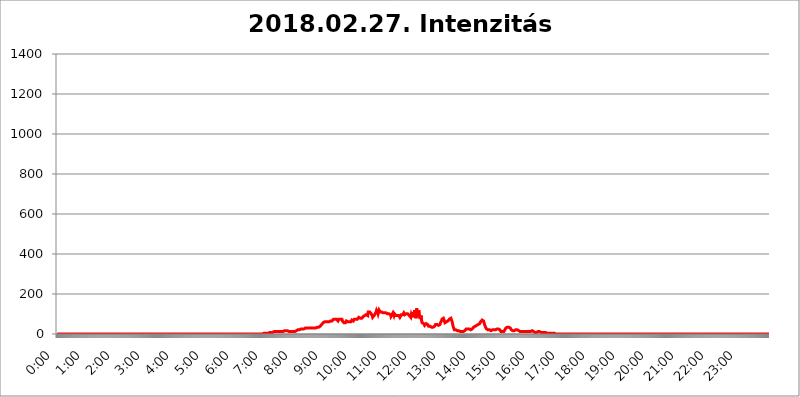
| Category | 2018.02.27. Intenzitás [W/m^2] |
|---|---|
| 0.0 | 0 |
| 0.0006944444444444445 | 0 |
| 0.001388888888888889 | 0 |
| 0.0020833333333333333 | 0 |
| 0.002777777777777778 | 0 |
| 0.003472222222222222 | 0 |
| 0.004166666666666667 | 0 |
| 0.004861111111111111 | 0 |
| 0.005555555555555556 | 0 |
| 0.0062499999999999995 | 0 |
| 0.006944444444444444 | 0 |
| 0.007638888888888889 | 0 |
| 0.008333333333333333 | 0 |
| 0.009027777777777779 | 0 |
| 0.009722222222222222 | 0 |
| 0.010416666666666666 | 0 |
| 0.011111111111111112 | 0 |
| 0.011805555555555555 | 0 |
| 0.012499999999999999 | 0 |
| 0.013194444444444444 | 0 |
| 0.013888888888888888 | 0 |
| 0.014583333333333332 | 0 |
| 0.015277777777777777 | 0 |
| 0.015972222222222224 | 0 |
| 0.016666666666666666 | 0 |
| 0.017361111111111112 | 0 |
| 0.018055555555555557 | 0 |
| 0.01875 | 0 |
| 0.019444444444444445 | 0 |
| 0.02013888888888889 | 0 |
| 0.020833333333333332 | 0 |
| 0.02152777777777778 | 0 |
| 0.022222222222222223 | 0 |
| 0.02291666666666667 | 0 |
| 0.02361111111111111 | 0 |
| 0.024305555555555556 | 0 |
| 0.024999999999999998 | 0 |
| 0.025694444444444447 | 0 |
| 0.02638888888888889 | 0 |
| 0.027083333333333334 | 0 |
| 0.027777777777777776 | 0 |
| 0.02847222222222222 | 0 |
| 0.029166666666666664 | 0 |
| 0.029861111111111113 | 0 |
| 0.030555555555555555 | 0 |
| 0.03125 | 0 |
| 0.03194444444444445 | 0 |
| 0.03263888888888889 | 0 |
| 0.03333333333333333 | 0 |
| 0.034027777777777775 | 0 |
| 0.034722222222222224 | 0 |
| 0.035416666666666666 | 0 |
| 0.036111111111111115 | 0 |
| 0.03680555555555556 | 0 |
| 0.0375 | 0 |
| 0.03819444444444444 | 0 |
| 0.03888888888888889 | 0 |
| 0.03958333333333333 | 0 |
| 0.04027777777777778 | 0 |
| 0.04097222222222222 | 0 |
| 0.041666666666666664 | 0 |
| 0.042361111111111106 | 0 |
| 0.04305555555555556 | 0 |
| 0.043750000000000004 | 0 |
| 0.044444444444444446 | 0 |
| 0.04513888888888889 | 0 |
| 0.04583333333333334 | 0 |
| 0.04652777777777778 | 0 |
| 0.04722222222222222 | 0 |
| 0.04791666666666666 | 0 |
| 0.04861111111111111 | 0 |
| 0.049305555555555554 | 0 |
| 0.049999999999999996 | 0 |
| 0.05069444444444445 | 0 |
| 0.051388888888888894 | 0 |
| 0.052083333333333336 | 0 |
| 0.05277777777777778 | 0 |
| 0.05347222222222222 | 0 |
| 0.05416666666666667 | 0 |
| 0.05486111111111111 | 0 |
| 0.05555555555555555 | 0 |
| 0.05625 | 0 |
| 0.05694444444444444 | 0 |
| 0.057638888888888885 | 0 |
| 0.05833333333333333 | 0 |
| 0.05902777777777778 | 0 |
| 0.059722222222222225 | 0 |
| 0.06041666666666667 | 0 |
| 0.061111111111111116 | 0 |
| 0.06180555555555556 | 0 |
| 0.0625 | 0 |
| 0.06319444444444444 | 0 |
| 0.06388888888888888 | 0 |
| 0.06458333333333334 | 0 |
| 0.06527777777777778 | 0 |
| 0.06597222222222222 | 0 |
| 0.06666666666666667 | 0 |
| 0.06736111111111111 | 0 |
| 0.06805555555555555 | 0 |
| 0.06874999999999999 | 0 |
| 0.06944444444444443 | 0 |
| 0.07013888888888889 | 0 |
| 0.07083333333333333 | 0 |
| 0.07152777777777779 | 0 |
| 0.07222222222222223 | 0 |
| 0.07291666666666667 | 0 |
| 0.07361111111111111 | 0 |
| 0.07430555555555556 | 0 |
| 0.075 | 0 |
| 0.07569444444444444 | 0 |
| 0.0763888888888889 | 0 |
| 0.07708333333333334 | 0 |
| 0.07777777777777778 | 0 |
| 0.07847222222222222 | 0 |
| 0.07916666666666666 | 0 |
| 0.0798611111111111 | 0 |
| 0.08055555555555556 | 0 |
| 0.08125 | 0 |
| 0.08194444444444444 | 0 |
| 0.08263888888888889 | 0 |
| 0.08333333333333333 | 0 |
| 0.08402777777777777 | 0 |
| 0.08472222222222221 | 0 |
| 0.08541666666666665 | 0 |
| 0.08611111111111112 | 0 |
| 0.08680555555555557 | 0 |
| 0.08750000000000001 | 0 |
| 0.08819444444444445 | 0 |
| 0.08888888888888889 | 0 |
| 0.08958333333333333 | 0 |
| 0.09027777777777778 | 0 |
| 0.09097222222222222 | 0 |
| 0.09166666666666667 | 0 |
| 0.09236111111111112 | 0 |
| 0.09305555555555556 | 0 |
| 0.09375 | 0 |
| 0.09444444444444444 | 0 |
| 0.09513888888888888 | 0 |
| 0.09583333333333333 | 0 |
| 0.09652777777777777 | 0 |
| 0.09722222222222222 | 0 |
| 0.09791666666666667 | 0 |
| 0.09861111111111111 | 0 |
| 0.09930555555555555 | 0 |
| 0.09999999999999999 | 0 |
| 0.10069444444444443 | 0 |
| 0.1013888888888889 | 0 |
| 0.10208333333333335 | 0 |
| 0.10277777777777779 | 0 |
| 0.10347222222222223 | 0 |
| 0.10416666666666667 | 0 |
| 0.10486111111111111 | 0 |
| 0.10555555555555556 | 0 |
| 0.10625 | 0 |
| 0.10694444444444444 | 0 |
| 0.1076388888888889 | 0 |
| 0.10833333333333334 | 0 |
| 0.10902777777777778 | 0 |
| 0.10972222222222222 | 0 |
| 0.1111111111111111 | 0 |
| 0.11180555555555556 | 0 |
| 0.11180555555555556 | 0 |
| 0.1125 | 0 |
| 0.11319444444444444 | 0 |
| 0.11388888888888889 | 0 |
| 0.11458333333333333 | 0 |
| 0.11527777777777777 | 0 |
| 0.11597222222222221 | 0 |
| 0.11666666666666665 | 0 |
| 0.1173611111111111 | 0 |
| 0.11805555555555557 | 0 |
| 0.11944444444444445 | 0 |
| 0.12013888888888889 | 0 |
| 0.12083333333333333 | 0 |
| 0.12152777777777778 | 0 |
| 0.12222222222222223 | 0 |
| 0.12291666666666667 | 0 |
| 0.12291666666666667 | 0 |
| 0.12361111111111112 | 0 |
| 0.12430555555555556 | 0 |
| 0.125 | 0 |
| 0.12569444444444444 | 0 |
| 0.12638888888888888 | 0 |
| 0.12708333333333333 | 0 |
| 0.16875 | 0 |
| 0.12847222222222224 | 0 |
| 0.12916666666666668 | 0 |
| 0.12986111111111112 | 0 |
| 0.13055555555555556 | 0 |
| 0.13125 | 0 |
| 0.13194444444444445 | 0 |
| 0.1326388888888889 | 0 |
| 0.13333333333333333 | 0 |
| 0.13402777777777777 | 0 |
| 0.13402777777777777 | 0 |
| 0.13472222222222222 | 0 |
| 0.13541666666666666 | 0 |
| 0.1361111111111111 | 0 |
| 0.13749999999999998 | 0 |
| 0.13819444444444443 | 0 |
| 0.1388888888888889 | 0 |
| 0.13958333333333334 | 0 |
| 0.14027777777777778 | 0 |
| 0.14097222222222222 | 0 |
| 0.14166666666666666 | 0 |
| 0.1423611111111111 | 0 |
| 0.14305555555555557 | 0 |
| 0.14375000000000002 | 0 |
| 0.14444444444444446 | 0 |
| 0.1451388888888889 | 0 |
| 0.1451388888888889 | 0 |
| 0.14652777777777778 | 0 |
| 0.14722222222222223 | 0 |
| 0.14791666666666667 | 0 |
| 0.1486111111111111 | 0 |
| 0.14930555555555555 | 0 |
| 0.15 | 0 |
| 0.15069444444444444 | 0 |
| 0.15138888888888888 | 0 |
| 0.15208333333333332 | 0 |
| 0.15277777777777776 | 0 |
| 0.15347222222222223 | 0 |
| 0.15416666666666667 | 0 |
| 0.15486111111111112 | 0 |
| 0.15555555555555556 | 0 |
| 0.15625 | 0 |
| 0.15694444444444444 | 0 |
| 0.15763888888888888 | 0 |
| 0.15833333333333333 | 0 |
| 0.15902777777777777 | 0 |
| 0.15972222222222224 | 0 |
| 0.16041666666666668 | 0 |
| 0.16111111111111112 | 0 |
| 0.16180555555555556 | 0 |
| 0.1625 | 0 |
| 0.16319444444444445 | 0 |
| 0.1638888888888889 | 0 |
| 0.16458333333333333 | 0 |
| 0.16527777777777777 | 0 |
| 0.16597222222222222 | 0 |
| 0.16666666666666666 | 0 |
| 0.1673611111111111 | 0 |
| 0.16805555555555554 | 0 |
| 0.16874999999999998 | 0 |
| 0.16944444444444443 | 0 |
| 0.17013888888888887 | 0 |
| 0.1708333333333333 | 0 |
| 0.17152777777777775 | 0 |
| 0.17222222222222225 | 0 |
| 0.1729166666666667 | 0 |
| 0.17361111111111113 | 0 |
| 0.17430555555555557 | 0 |
| 0.17500000000000002 | 0 |
| 0.17569444444444446 | 0 |
| 0.1763888888888889 | 0 |
| 0.17708333333333334 | 0 |
| 0.17777777777777778 | 0 |
| 0.17847222222222223 | 0 |
| 0.17916666666666667 | 0 |
| 0.1798611111111111 | 0 |
| 0.18055555555555555 | 0 |
| 0.18125 | 0 |
| 0.18194444444444444 | 0 |
| 0.1826388888888889 | 0 |
| 0.18333333333333335 | 0 |
| 0.1840277777777778 | 0 |
| 0.18472222222222223 | 0 |
| 0.18541666666666667 | 0 |
| 0.18611111111111112 | 0 |
| 0.18680555555555556 | 0 |
| 0.1875 | 0 |
| 0.18819444444444444 | 0 |
| 0.18888888888888888 | 0 |
| 0.18958333333333333 | 0 |
| 0.19027777777777777 | 0 |
| 0.1909722222222222 | 0 |
| 0.19166666666666665 | 0 |
| 0.19236111111111112 | 0 |
| 0.19305555555555554 | 0 |
| 0.19375 | 0 |
| 0.19444444444444445 | 0 |
| 0.1951388888888889 | 0 |
| 0.19583333333333333 | 0 |
| 0.19652777777777777 | 0 |
| 0.19722222222222222 | 0 |
| 0.19791666666666666 | 0 |
| 0.1986111111111111 | 0 |
| 0.19930555555555554 | 0 |
| 0.19999999999999998 | 0 |
| 0.20069444444444443 | 0 |
| 0.20138888888888887 | 0 |
| 0.2020833333333333 | 0 |
| 0.2027777777777778 | 0 |
| 0.2034722222222222 | 0 |
| 0.2041666666666667 | 0 |
| 0.20486111111111113 | 0 |
| 0.20555555555555557 | 0 |
| 0.20625000000000002 | 0 |
| 0.20694444444444446 | 0 |
| 0.2076388888888889 | 0 |
| 0.20833333333333334 | 0 |
| 0.20902777777777778 | 0 |
| 0.20972222222222223 | 0 |
| 0.21041666666666667 | 0 |
| 0.2111111111111111 | 0 |
| 0.21180555555555555 | 0 |
| 0.2125 | 0 |
| 0.21319444444444444 | 0 |
| 0.2138888888888889 | 0 |
| 0.21458333333333335 | 0 |
| 0.2152777777777778 | 0 |
| 0.21597222222222223 | 0 |
| 0.21666666666666667 | 0 |
| 0.21736111111111112 | 0 |
| 0.21805555555555556 | 0 |
| 0.21875 | 0 |
| 0.21944444444444444 | 0 |
| 0.22013888888888888 | 0 |
| 0.22083333333333333 | 0 |
| 0.22152777777777777 | 0 |
| 0.2222222222222222 | 0 |
| 0.22291666666666665 | 0 |
| 0.2236111111111111 | 0 |
| 0.22430555555555556 | 0 |
| 0.225 | 0 |
| 0.22569444444444445 | 0 |
| 0.2263888888888889 | 0 |
| 0.22708333333333333 | 0 |
| 0.22777777777777777 | 0 |
| 0.22847222222222222 | 0 |
| 0.22916666666666666 | 0 |
| 0.2298611111111111 | 0 |
| 0.23055555555555554 | 0 |
| 0.23124999999999998 | 0 |
| 0.23194444444444443 | 0 |
| 0.23263888888888887 | 0 |
| 0.2333333333333333 | 0 |
| 0.2340277777777778 | 0 |
| 0.2347222222222222 | 0 |
| 0.2354166666666667 | 0 |
| 0.23611111111111113 | 0 |
| 0.23680555555555557 | 0 |
| 0.23750000000000002 | 0 |
| 0.23819444444444446 | 0 |
| 0.2388888888888889 | 0 |
| 0.23958333333333334 | 0 |
| 0.24027777777777778 | 0 |
| 0.24097222222222223 | 0 |
| 0.24166666666666667 | 0 |
| 0.2423611111111111 | 0 |
| 0.24305555555555555 | 0 |
| 0.24375 | 0 |
| 0.24444444444444446 | 0 |
| 0.24513888888888888 | 0 |
| 0.24583333333333335 | 0 |
| 0.2465277777777778 | 0 |
| 0.24722222222222223 | 0 |
| 0.24791666666666667 | 0 |
| 0.24861111111111112 | 0 |
| 0.24930555555555556 | 0 |
| 0.25 | 0 |
| 0.25069444444444444 | 0 |
| 0.2513888888888889 | 0 |
| 0.2520833333333333 | 0 |
| 0.25277777777777777 | 0 |
| 0.2534722222222222 | 0 |
| 0.25416666666666665 | 0 |
| 0.2548611111111111 | 0 |
| 0.2555555555555556 | 0 |
| 0.25625000000000003 | 0 |
| 0.2569444444444445 | 0 |
| 0.2576388888888889 | 0 |
| 0.25833333333333336 | 0 |
| 0.2590277777777778 | 0 |
| 0.25972222222222224 | 0 |
| 0.2604166666666667 | 0 |
| 0.2611111111111111 | 0 |
| 0.26180555555555557 | 0 |
| 0.2625 | 0 |
| 0.26319444444444445 | 0 |
| 0.2638888888888889 | 0 |
| 0.26458333333333334 | 0 |
| 0.2652777777777778 | 0 |
| 0.2659722222222222 | 0 |
| 0.26666666666666666 | 0 |
| 0.2673611111111111 | 0 |
| 0.26805555555555555 | 0 |
| 0.26875 | 0 |
| 0.26944444444444443 | 0 |
| 0.2701388888888889 | 0 |
| 0.2708333333333333 | 0 |
| 0.27152777777777776 | 0 |
| 0.2722222222222222 | 0 |
| 0.27291666666666664 | 0 |
| 0.2736111111111111 | 0 |
| 0.2743055555555555 | 0 |
| 0.27499999999999997 | 0 |
| 0.27569444444444446 | 0 |
| 0.27638888888888885 | 0 |
| 0.27708333333333335 | 0 |
| 0.2777777777777778 | 0 |
| 0.27847222222222223 | 0 |
| 0.2791666666666667 | 0 |
| 0.2798611111111111 | 0 |
| 0.28055555555555556 | 0 |
| 0.28125 | 0 |
| 0.28194444444444444 | 0 |
| 0.2826388888888889 | 0 |
| 0.2833333333333333 | 0 |
| 0.28402777777777777 | 0 |
| 0.2847222222222222 | 0 |
| 0.28541666666666665 | 0 |
| 0.28611111111111115 | 0 |
| 0.28680555555555554 | 0 |
| 0.28750000000000003 | 0 |
| 0.2881944444444445 | 3.525 |
| 0.2888888888888889 | 3.525 |
| 0.28958333333333336 | 3.525 |
| 0.2902777777777778 | 3.525 |
| 0.29097222222222224 | 3.525 |
| 0.2916666666666667 | 3.525 |
| 0.2923611111111111 | 3.525 |
| 0.29305555555555557 | 3.525 |
| 0.29375 | 3.525 |
| 0.29444444444444445 | 3.525 |
| 0.2951388888888889 | 3.525 |
| 0.29583333333333334 | 3.525 |
| 0.2965277777777778 | 3.525 |
| 0.2972222222222222 | 3.525 |
| 0.29791666666666666 | 7.887 |
| 0.2986111111111111 | 7.887 |
| 0.29930555555555555 | 7.887 |
| 0.3 | 7.887 |
| 0.30069444444444443 | 7.887 |
| 0.3013888888888889 | 7.887 |
| 0.3020833333333333 | 7.887 |
| 0.30277777777777776 | 7.887 |
| 0.3034722222222222 | 7.887 |
| 0.30416666666666664 | 12.257 |
| 0.3048611111111111 | 7.887 |
| 0.3055555555555555 | 12.257 |
| 0.30624999999999997 | 12.257 |
| 0.3069444444444444 | 12.257 |
| 0.3076388888888889 | 12.257 |
| 0.30833333333333335 | 12.257 |
| 0.3090277777777778 | 12.257 |
| 0.30972222222222223 | 12.257 |
| 0.3104166666666667 | 12.257 |
| 0.3111111111111111 | 12.257 |
| 0.31180555555555556 | 12.257 |
| 0.3125 | 12.257 |
| 0.31319444444444444 | 12.257 |
| 0.3138888888888889 | 12.257 |
| 0.3145833333333333 | 12.257 |
| 0.31527777777777777 | 12.257 |
| 0.3159722222222222 | 12.257 |
| 0.31666666666666665 | 12.257 |
| 0.31736111111111115 | 12.257 |
| 0.31805555555555554 | 12.257 |
| 0.31875000000000003 | 16.636 |
| 0.3194444444444445 | 16.636 |
| 0.3201388888888889 | 16.636 |
| 0.32083333333333336 | 16.636 |
| 0.3215277777777778 | 16.636 |
| 0.32222222222222224 | 16.636 |
| 0.3229166666666667 | 16.636 |
| 0.3236111111111111 | 12.257 |
| 0.32430555555555557 | 12.257 |
| 0.325 | 12.257 |
| 0.32569444444444445 | 12.257 |
| 0.3263888888888889 | 12.257 |
| 0.32708333333333334 | 12.257 |
| 0.3277777777777778 | 12.257 |
| 0.3284722222222222 | 12.257 |
| 0.32916666666666666 | 12.257 |
| 0.3298611111111111 | 12.257 |
| 0.33055555555555555 | 12.257 |
| 0.33125 | 12.257 |
| 0.33194444444444443 | 12.257 |
| 0.3326388888888889 | 12.257 |
| 0.3333333333333333 | 12.257 |
| 0.3340277777777778 | 16.636 |
| 0.3347222222222222 | 16.636 |
| 0.3354166666666667 | 16.636 |
| 0.3361111111111111 | 16.636 |
| 0.3368055555555556 | 21.024 |
| 0.33749999999999997 | 21.024 |
| 0.33819444444444446 | 21.024 |
| 0.33888888888888885 | 21.024 |
| 0.33958333333333335 | 21.024 |
| 0.34027777777777773 | 21.024 |
| 0.34097222222222223 | 21.024 |
| 0.3416666666666666 | 25.419 |
| 0.3423611111111111 | 25.419 |
| 0.3430555555555555 | 25.419 |
| 0.34375 | 25.419 |
| 0.3444444444444445 | 25.419 |
| 0.3451388888888889 | 25.419 |
| 0.3458333333333334 | 25.419 |
| 0.34652777777777777 | 25.419 |
| 0.34722222222222227 | 25.419 |
| 0.34791666666666665 | 29.823 |
| 0.34861111111111115 | 25.419 |
| 0.34930555555555554 | 29.823 |
| 0.35000000000000003 | 29.823 |
| 0.3506944444444444 | 29.823 |
| 0.3513888888888889 | 29.823 |
| 0.3520833333333333 | 29.823 |
| 0.3527777777777778 | 29.823 |
| 0.3534722222222222 | 34.234 |
| 0.3541666666666667 | 29.823 |
| 0.3548611111111111 | 29.823 |
| 0.35555555555555557 | 29.823 |
| 0.35625 | 29.823 |
| 0.35694444444444445 | 29.823 |
| 0.3576388888888889 | 29.823 |
| 0.35833333333333334 | 29.823 |
| 0.3590277777777778 | 29.823 |
| 0.3597222222222222 | 29.823 |
| 0.36041666666666666 | 29.823 |
| 0.3611111111111111 | 29.823 |
| 0.36180555555555555 | 29.823 |
| 0.3625 | 29.823 |
| 0.36319444444444443 | 29.823 |
| 0.3638888888888889 | 34.234 |
| 0.3645833333333333 | 34.234 |
| 0.3652777777777778 | 34.234 |
| 0.3659722222222222 | 34.234 |
| 0.3666666666666667 | 34.234 |
| 0.3673611111111111 | 34.234 |
| 0.3680555555555556 | 38.653 |
| 0.36874999999999997 | 38.653 |
| 0.36944444444444446 | 43.079 |
| 0.37013888888888885 | 43.079 |
| 0.37083333333333335 | 47.511 |
| 0.37152777777777773 | 47.511 |
| 0.37222222222222223 | 51.951 |
| 0.3729166666666666 | 56.398 |
| 0.3736111111111111 | 56.398 |
| 0.3743055555555555 | 56.398 |
| 0.375 | 60.85 |
| 0.3756944444444445 | 60.85 |
| 0.3763888888888889 | 60.85 |
| 0.3770833333333334 | 60.85 |
| 0.37777777777777777 | 60.85 |
| 0.37847222222222227 | 60.85 |
| 0.37916666666666665 | 60.85 |
| 0.37986111111111115 | 65.31 |
| 0.38055555555555554 | 65.31 |
| 0.38125000000000003 | 60.85 |
| 0.3819444444444444 | 65.31 |
| 0.3826388888888889 | 65.31 |
| 0.3833333333333333 | 65.31 |
| 0.3840277777777778 | 65.31 |
| 0.3847222222222222 | 69.775 |
| 0.3854166666666667 | 65.31 |
| 0.3861111111111111 | 65.31 |
| 0.38680555555555557 | 69.775 |
| 0.3875 | 74.246 |
| 0.38819444444444445 | 74.246 |
| 0.3888888888888889 | 69.775 |
| 0.38958333333333334 | 74.246 |
| 0.3902777777777778 | 74.246 |
| 0.3909722222222222 | 69.775 |
| 0.39166666666666666 | 74.246 |
| 0.3923611111111111 | 69.775 |
| 0.39305555555555555 | 74.246 |
| 0.39375 | 65.31 |
| 0.39444444444444443 | 65.31 |
| 0.3951388888888889 | 74.246 |
| 0.3958333333333333 | 74.246 |
| 0.3965277777777778 | 74.246 |
| 0.3972222222222222 | 74.246 |
| 0.3979166666666667 | 78.722 |
| 0.3986111111111111 | 74.246 |
| 0.3993055555555556 | 74.246 |
| 0.39999999999999997 | 65.31 |
| 0.40069444444444446 | 60.85 |
| 0.40138888888888885 | 60.85 |
| 0.40208333333333335 | 56.398 |
| 0.40277777777777773 | 60.85 |
| 0.40347222222222223 | 51.951 |
| 0.4041666666666666 | 56.398 |
| 0.4048611111111111 | 60.85 |
| 0.4055555555555555 | 65.31 |
| 0.40625 | 60.85 |
| 0.4069444444444445 | 60.85 |
| 0.4076388888888889 | 60.85 |
| 0.4083333333333334 | 56.398 |
| 0.40902777777777777 | 60.85 |
| 0.40972222222222227 | 60.85 |
| 0.41041666666666665 | 65.31 |
| 0.41111111111111115 | 65.31 |
| 0.41180555555555554 | 60.85 |
| 0.41250000000000003 | 65.31 |
| 0.4131944444444444 | 69.775 |
| 0.4138888888888889 | 69.775 |
| 0.4145833333333333 | 65.31 |
| 0.4152777777777778 | 65.31 |
| 0.4159722222222222 | 65.31 |
| 0.4166666666666667 | 74.246 |
| 0.4173611111111111 | 74.246 |
| 0.41805555555555557 | 74.246 |
| 0.41875 | 74.246 |
| 0.41944444444444445 | 74.246 |
| 0.4201388888888889 | 74.246 |
| 0.42083333333333334 | 74.246 |
| 0.4215277777777778 | 74.246 |
| 0.4222222222222222 | 78.722 |
| 0.42291666666666666 | 83.205 |
| 0.4236111111111111 | 83.205 |
| 0.42430555555555555 | 83.205 |
| 0.425 | 78.722 |
| 0.42569444444444443 | 74.246 |
| 0.4263888888888889 | 78.722 |
| 0.4270833333333333 | 78.722 |
| 0.4277777777777778 | 83.205 |
| 0.4284722222222222 | 83.205 |
| 0.4291666666666667 | 87.692 |
| 0.4298611111111111 | 92.184 |
| 0.4305555555555556 | 92.184 |
| 0.43124999999999997 | 92.184 |
| 0.43194444444444446 | 92.184 |
| 0.43263888888888885 | 92.184 |
| 0.43333333333333335 | 96.682 |
| 0.43402777777777773 | 101.184 |
| 0.43472222222222223 | 101.184 |
| 0.4354166666666666 | 92.184 |
| 0.4361111111111111 | 110.201 |
| 0.4368055555555555 | 114.716 |
| 0.4375 | 110.201 |
| 0.4381944444444445 | 110.201 |
| 0.4388888888888889 | 110.201 |
| 0.4395833333333334 | 105.69 |
| 0.44027777777777777 | 101.184 |
| 0.44097222222222227 | 101.184 |
| 0.44166666666666665 | 92.184 |
| 0.44236111111111115 | 83.205 |
| 0.44305555555555554 | 83.205 |
| 0.44375000000000003 | 83.205 |
| 0.4444444444444444 | 92.184 |
| 0.4451388888888889 | 92.184 |
| 0.4458333333333333 | 101.184 |
| 0.4465277777777778 | 101.184 |
| 0.4472222222222222 | 110.201 |
| 0.4479166666666667 | 119.235 |
| 0.4486111111111111 | 114.716 |
| 0.44930555555555557 | 110.201 |
| 0.45 | 101.184 |
| 0.45069444444444445 | 110.201 |
| 0.4513888888888889 | 119.235 |
| 0.45208333333333334 | 119.235 |
| 0.4527777777777778 | 110.201 |
| 0.4534722222222222 | 110.201 |
| 0.45416666666666666 | 114.716 |
| 0.4548611111111111 | 110.201 |
| 0.45555555555555555 | 110.201 |
| 0.45625 | 110.201 |
| 0.45694444444444443 | 105.69 |
| 0.4576388888888889 | 101.184 |
| 0.4583333333333333 | 101.184 |
| 0.4590277777777778 | 105.69 |
| 0.4597222222222222 | 110.201 |
| 0.4604166666666667 | 110.201 |
| 0.4611111111111111 | 105.69 |
| 0.4618055555555556 | 101.184 |
| 0.46249999999999997 | 101.184 |
| 0.46319444444444446 | 101.184 |
| 0.46388888888888885 | 96.682 |
| 0.46458333333333335 | 101.184 |
| 0.46527777777777773 | 101.184 |
| 0.46597222222222223 | 96.682 |
| 0.4666666666666666 | 96.682 |
| 0.4673611111111111 | 96.682 |
| 0.4680555555555555 | 87.692 |
| 0.46875 | 87.692 |
| 0.4694444444444445 | 96.682 |
| 0.4701388888888889 | 101.184 |
| 0.4708333333333334 | 105.69 |
| 0.47152777777777777 | 105.69 |
| 0.47222222222222227 | 92.184 |
| 0.47291666666666665 | 101.184 |
| 0.47361111111111115 | 105.69 |
| 0.47430555555555554 | 96.682 |
| 0.47500000000000003 | 92.184 |
| 0.4756944444444444 | 87.692 |
| 0.4763888888888889 | 92.184 |
| 0.4770833333333333 | 92.184 |
| 0.4777777777777778 | 92.184 |
| 0.4784722222222222 | 87.692 |
| 0.4791666666666667 | 92.184 |
| 0.4798611111111111 | 87.692 |
| 0.48055555555555557 | 83.205 |
| 0.48125 | 83.205 |
| 0.48194444444444445 | 87.692 |
| 0.4826388888888889 | 96.682 |
| 0.48333333333333334 | 92.184 |
| 0.4840277777777778 | 96.682 |
| 0.4847222222222222 | 96.682 |
| 0.48541666666666666 | 96.682 |
| 0.4861111111111111 | 105.69 |
| 0.48680555555555555 | 101.184 |
| 0.4875 | 96.682 |
| 0.48819444444444443 | 101.184 |
| 0.4888888888888889 | 96.682 |
| 0.4895833333333333 | 101.184 |
| 0.4902777777777778 | 105.69 |
| 0.4909722222222222 | 105.69 |
| 0.4916666666666667 | 101.184 |
| 0.4923611111111111 | 96.682 |
| 0.4930555555555556 | 96.682 |
| 0.49374999999999997 | 92.184 |
| 0.49444444444444446 | 87.692 |
| 0.49513888888888885 | 92.184 |
| 0.49583333333333335 | 83.205 |
| 0.49652777777777773 | 96.682 |
| 0.49722222222222223 | 92.184 |
| 0.4979166666666666 | 83.205 |
| 0.4986111111111111 | 110.201 |
| 0.4993055555555555 | 92.184 |
| 0.5 | 101.184 |
| 0.5006944444444444 | 110.201 |
| 0.5013888888888889 | 119.235 |
| 0.5020833333333333 | 105.69 |
| 0.5027777777777778 | 78.722 |
| 0.5034722222222222 | 101.184 |
| 0.5041666666666667 | 128.284 |
| 0.5048611111111111 | 101.184 |
| 0.5055555555555555 | 83.205 |
| 0.50625 | 87.692 |
| 0.5069444444444444 | 119.235 |
| 0.5076388888888889 | 101.184 |
| 0.5083333333333333 | 87.692 |
| 0.5090277777777777 | 74.246 |
| 0.5097222222222222 | 83.205 |
| 0.5104166666666666 | 92.184 |
| 0.5111111111111112 | 65.31 |
| 0.5118055555555555 | 56.398 |
| 0.5125000000000001 | 56.398 |
| 0.5131944444444444 | 56.398 |
| 0.513888888888889 | 51.951 |
| 0.5145833333333333 | 47.511 |
| 0.5152777777777778 | 43.079 |
| 0.5159722222222222 | 43.079 |
| 0.5166666666666667 | 47.511 |
| 0.517361111111111 | 51.951 |
| 0.5180555555555556 | 51.951 |
| 0.5187499999999999 | 51.951 |
| 0.5194444444444445 | 47.511 |
| 0.5201388888888888 | 43.079 |
| 0.5208333333333334 | 38.653 |
| 0.5215277777777778 | 43.079 |
| 0.5222222222222223 | 43.079 |
| 0.5229166666666667 | 38.653 |
| 0.5236111111111111 | 38.653 |
| 0.5243055555555556 | 34.234 |
| 0.525 | 34.234 |
| 0.5256944444444445 | 34.234 |
| 0.5263888888888889 | 34.234 |
| 0.5270833333333333 | 34.234 |
| 0.5277777777777778 | 34.234 |
| 0.5284722222222222 | 38.653 |
| 0.5291666666666667 | 38.653 |
| 0.5298611111111111 | 43.079 |
| 0.5305555555555556 | 47.511 |
| 0.53125 | 47.511 |
| 0.5319444444444444 | 47.511 |
| 0.5326388888888889 | 47.511 |
| 0.5333333333333333 | 43.079 |
| 0.5340277777777778 | 43.079 |
| 0.5347222222222222 | 43.079 |
| 0.5354166666666667 | 43.079 |
| 0.5361111111111111 | 47.511 |
| 0.5368055555555555 | 47.511 |
| 0.5375 | 56.398 |
| 0.5381944444444444 | 60.85 |
| 0.5388888888888889 | 65.31 |
| 0.5395833333333333 | 74.246 |
| 0.5402777777777777 | 74.246 |
| 0.5409722222222222 | 78.722 |
| 0.5416666666666666 | 78.722 |
| 0.5423611111111112 | 74.246 |
| 0.5430555555555555 | 65.31 |
| 0.5437500000000001 | 56.398 |
| 0.5444444444444444 | 56.398 |
| 0.545138888888889 | 60.85 |
| 0.5458333333333333 | 60.85 |
| 0.5465277777777778 | 60.85 |
| 0.5472222222222222 | 60.85 |
| 0.5479166666666667 | 65.31 |
| 0.548611111111111 | 65.31 |
| 0.5493055555555556 | 69.775 |
| 0.5499999999999999 | 74.246 |
| 0.5506944444444445 | 74.246 |
| 0.5513888888888888 | 74.246 |
| 0.5520833333333334 | 78.722 |
| 0.5527777777777778 | 78.722 |
| 0.5534722222222223 | 65.31 |
| 0.5541666666666667 | 56.398 |
| 0.5548611111111111 | 43.079 |
| 0.5555555555555556 | 34.234 |
| 0.55625 | 29.823 |
| 0.5569444444444445 | 21.024 |
| 0.5576388888888889 | 21.024 |
| 0.5583333333333333 | 21.024 |
| 0.5590277777777778 | 21.024 |
| 0.5597222222222222 | 21.024 |
| 0.5604166666666667 | 16.636 |
| 0.5611111111111111 | 16.636 |
| 0.5618055555555556 | 16.636 |
| 0.5625 | 16.636 |
| 0.5631944444444444 | 16.636 |
| 0.5638888888888889 | 12.257 |
| 0.5645833333333333 | 12.257 |
| 0.5652777777777778 | 12.257 |
| 0.5659722222222222 | 12.257 |
| 0.5666666666666667 | 12.257 |
| 0.5673611111111111 | 12.257 |
| 0.5680555555555555 | 12.257 |
| 0.56875 | 12.257 |
| 0.5694444444444444 | 12.257 |
| 0.5701388888888889 | 12.257 |
| 0.5708333333333333 | 12.257 |
| 0.5715277777777777 | 16.636 |
| 0.5722222222222222 | 16.636 |
| 0.5729166666666666 | 21.024 |
| 0.5736111111111112 | 25.419 |
| 0.5743055555555555 | 25.419 |
| 0.5750000000000001 | 25.419 |
| 0.5756944444444444 | 25.419 |
| 0.576388888888889 | 25.419 |
| 0.5770833333333333 | 25.419 |
| 0.5777777777777778 | 25.419 |
| 0.5784722222222222 | 21.024 |
| 0.5791666666666667 | 21.024 |
| 0.579861111111111 | 21.024 |
| 0.5805555555555556 | 21.024 |
| 0.5812499999999999 | 21.024 |
| 0.5819444444444445 | 25.419 |
| 0.5826388888888888 | 25.419 |
| 0.5833333333333334 | 29.823 |
| 0.5840277777777778 | 34.234 |
| 0.5847222222222223 | 38.653 |
| 0.5854166666666667 | 38.653 |
| 0.5861111111111111 | 38.653 |
| 0.5868055555555556 | 38.653 |
| 0.5875 | 38.653 |
| 0.5881944444444445 | 43.079 |
| 0.5888888888888889 | 43.079 |
| 0.5895833333333333 | 47.511 |
| 0.5902777777777778 | 47.511 |
| 0.5909722222222222 | 51.951 |
| 0.5916666666666667 | 51.951 |
| 0.5923611111111111 | 51.951 |
| 0.5930555555555556 | 56.398 |
| 0.59375 | 60.85 |
| 0.5944444444444444 | 65.31 |
| 0.5951388888888889 | 65.31 |
| 0.5958333333333333 | 69.775 |
| 0.5965277777777778 | 69.775 |
| 0.5972222222222222 | 65.31 |
| 0.5979166666666667 | 65.31 |
| 0.5986111111111111 | 56.398 |
| 0.5993055555555555 | 47.511 |
| 0.6 | 43.079 |
| 0.6006944444444444 | 34.234 |
| 0.6013888888888889 | 29.823 |
| 0.6020833333333333 | 25.419 |
| 0.6027777777777777 | 21.024 |
| 0.6034722222222222 | 21.024 |
| 0.6041666666666666 | 21.024 |
| 0.6048611111111112 | 16.636 |
| 0.6055555555555555 | 16.636 |
| 0.6062500000000001 | 21.024 |
| 0.6069444444444444 | 21.024 |
| 0.607638888888889 | 16.636 |
| 0.6083333333333333 | 16.636 |
| 0.6090277777777778 | 16.636 |
| 0.6097222222222222 | 16.636 |
| 0.6104166666666667 | 21.024 |
| 0.611111111111111 | 21.024 |
| 0.6118055555555556 | 21.024 |
| 0.6124999999999999 | 21.024 |
| 0.6131944444444445 | 21.024 |
| 0.6138888888888888 | 21.024 |
| 0.6145833333333334 | 21.024 |
| 0.6152777777777778 | 25.419 |
| 0.6159722222222223 | 25.419 |
| 0.6166666666666667 | 25.419 |
| 0.6173611111111111 | 25.419 |
| 0.6180555555555556 | 25.419 |
| 0.61875 | 25.419 |
| 0.6194444444444445 | 25.419 |
| 0.6201388888888889 | 25.419 |
| 0.6208333333333333 | 21.024 |
| 0.6215277777777778 | 16.636 |
| 0.6222222222222222 | 12.257 |
| 0.6229166666666667 | 12.257 |
| 0.6236111111111111 | 12.257 |
| 0.6243055555555556 | 12.257 |
| 0.625 | 12.257 |
| 0.6256944444444444 | 12.257 |
| 0.6263888888888889 | 12.257 |
| 0.6270833333333333 | 16.636 |
| 0.6277777777777778 | 21.024 |
| 0.6284722222222222 | 25.419 |
| 0.6291666666666667 | 29.823 |
| 0.6298611111111111 | 29.823 |
| 0.6305555555555555 | 29.823 |
| 0.63125 | 34.234 |
| 0.6319444444444444 | 34.234 |
| 0.6326388888888889 | 34.234 |
| 0.6333333333333333 | 34.234 |
| 0.6340277777777777 | 34.234 |
| 0.6347222222222222 | 34.234 |
| 0.6354166666666666 | 29.823 |
| 0.6361111111111112 | 25.419 |
| 0.6368055555555555 | 21.024 |
| 0.6375000000000001 | 21.024 |
| 0.6381944444444444 | 16.636 |
| 0.638888888888889 | 16.636 |
| 0.6395833333333333 | 16.636 |
| 0.6402777777777778 | 16.636 |
| 0.6409722222222222 | 16.636 |
| 0.6416666666666667 | 21.024 |
| 0.642361111111111 | 21.024 |
| 0.6430555555555556 | 21.024 |
| 0.6437499999999999 | 21.024 |
| 0.6444444444444445 | 21.024 |
| 0.6451388888888888 | 21.024 |
| 0.6458333333333334 | 21.024 |
| 0.6465277777777778 | 16.636 |
| 0.6472222222222223 | 16.636 |
| 0.6479166666666667 | 12.257 |
| 0.6486111111111111 | 12.257 |
| 0.6493055555555556 | 12.257 |
| 0.65 | 12.257 |
| 0.6506944444444445 | 12.257 |
| 0.6513888888888889 | 12.257 |
| 0.6520833333333333 | 12.257 |
| 0.6527777777777778 | 12.257 |
| 0.6534722222222222 | 12.257 |
| 0.6541666666666667 | 12.257 |
| 0.6548611111111111 | 12.257 |
| 0.6555555555555556 | 12.257 |
| 0.65625 | 12.257 |
| 0.6569444444444444 | 12.257 |
| 0.6576388888888889 | 12.257 |
| 0.6583333333333333 | 12.257 |
| 0.6590277777777778 | 12.257 |
| 0.6597222222222222 | 12.257 |
| 0.6604166666666667 | 12.257 |
| 0.6611111111111111 | 12.257 |
| 0.6618055555555555 | 12.257 |
| 0.6625 | 12.257 |
| 0.6631944444444444 | 12.257 |
| 0.6638888888888889 | 12.257 |
| 0.6645833333333333 | 16.636 |
| 0.6652777777777777 | 16.636 |
| 0.6659722222222222 | 16.636 |
| 0.6666666666666666 | 16.636 |
| 0.6673611111111111 | 12.257 |
| 0.6680555555555556 | 12.257 |
| 0.6687500000000001 | 7.887 |
| 0.6694444444444444 | 7.887 |
| 0.6701388888888888 | 7.887 |
| 0.6708333333333334 | 7.887 |
| 0.6715277777777778 | 7.887 |
| 0.6722222222222222 | 7.887 |
| 0.6729166666666666 | 12.257 |
| 0.6736111111111112 | 12.257 |
| 0.6743055555555556 | 12.257 |
| 0.6749999999999999 | 12.257 |
| 0.6756944444444444 | 12.257 |
| 0.6763888888888889 | 12.257 |
| 0.6770833333333334 | 12.257 |
| 0.6777777777777777 | 12.257 |
| 0.6784722222222223 | 7.887 |
| 0.6791666666666667 | 7.887 |
| 0.6798611111111111 | 7.887 |
| 0.6805555555555555 | 7.887 |
| 0.68125 | 3.525 |
| 0.6819444444444445 | 7.887 |
| 0.6826388888888889 | 7.887 |
| 0.6833333333333332 | 7.887 |
| 0.6840277777777778 | 7.887 |
| 0.6847222222222222 | 7.887 |
| 0.6854166666666667 | 7.887 |
| 0.686111111111111 | 7.887 |
| 0.6868055555555556 | 3.525 |
| 0.6875 | 3.525 |
| 0.6881944444444444 | 3.525 |
| 0.688888888888889 | 3.525 |
| 0.6895833333333333 | 3.525 |
| 0.6902777777777778 | 3.525 |
| 0.6909722222222222 | 3.525 |
| 0.6916666666666668 | 3.525 |
| 0.6923611111111111 | 3.525 |
| 0.6930555555555555 | 3.525 |
| 0.69375 | 3.525 |
| 0.6944444444444445 | 3.525 |
| 0.6951388888888889 | 3.525 |
| 0.6958333333333333 | 3.525 |
| 0.6965277777777777 | 3.525 |
| 0.6972222222222223 | 3.525 |
| 0.6979166666666666 | 3.525 |
| 0.6986111111111111 | 0 |
| 0.6993055555555556 | 0 |
| 0.7000000000000001 | 0 |
| 0.7006944444444444 | 0 |
| 0.7013888888888888 | 0 |
| 0.7020833333333334 | 0 |
| 0.7027777777777778 | 0 |
| 0.7034722222222222 | 0 |
| 0.7041666666666666 | 0 |
| 0.7048611111111112 | 0 |
| 0.7055555555555556 | 0 |
| 0.7062499999999999 | 0 |
| 0.7069444444444444 | 0 |
| 0.7076388888888889 | 0 |
| 0.7083333333333334 | 0 |
| 0.7090277777777777 | 0 |
| 0.7097222222222223 | 0 |
| 0.7104166666666667 | 0 |
| 0.7111111111111111 | 0 |
| 0.7118055555555555 | 0 |
| 0.7125 | 0 |
| 0.7131944444444445 | 0 |
| 0.7138888888888889 | 0 |
| 0.7145833333333332 | 0 |
| 0.7152777777777778 | 0 |
| 0.7159722222222222 | 0 |
| 0.7166666666666667 | 0 |
| 0.717361111111111 | 0 |
| 0.7180555555555556 | 0 |
| 0.71875 | 0 |
| 0.7194444444444444 | 0 |
| 0.720138888888889 | 0 |
| 0.7208333333333333 | 0 |
| 0.7215277777777778 | 0 |
| 0.7222222222222222 | 0 |
| 0.7229166666666668 | 0 |
| 0.7236111111111111 | 0 |
| 0.7243055555555555 | 0 |
| 0.725 | 0 |
| 0.7256944444444445 | 0 |
| 0.7263888888888889 | 0 |
| 0.7270833333333333 | 0 |
| 0.7277777777777777 | 0 |
| 0.7284722222222223 | 0 |
| 0.7291666666666666 | 0 |
| 0.7298611111111111 | 0 |
| 0.7305555555555556 | 0 |
| 0.7312500000000001 | 0 |
| 0.7319444444444444 | 0 |
| 0.7326388888888888 | 0 |
| 0.7333333333333334 | 0 |
| 0.7340277777777778 | 0 |
| 0.7347222222222222 | 0 |
| 0.7354166666666666 | 0 |
| 0.7361111111111112 | 0 |
| 0.7368055555555556 | 0 |
| 0.7374999999999999 | 0 |
| 0.7381944444444444 | 0 |
| 0.7388888888888889 | 0 |
| 0.7395833333333334 | 0 |
| 0.7402777777777777 | 0 |
| 0.7409722222222223 | 0 |
| 0.7416666666666667 | 0 |
| 0.7423611111111111 | 0 |
| 0.7430555555555555 | 0 |
| 0.74375 | 0 |
| 0.7444444444444445 | 0 |
| 0.7451388888888889 | 0 |
| 0.7458333333333332 | 0 |
| 0.7465277777777778 | 0 |
| 0.7472222222222222 | 0 |
| 0.7479166666666667 | 0 |
| 0.748611111111111 | 0 |
| 0.7493055555555556 | 0 |
| 0.75 | 0 |
| 0.7506944444444444 | 0 |
| 0.751388888888889 | 0 |
| 0.7520833333333333 | 0 |
| 0.7527777777777778 | 0 |
| 0.7534722222222222 | 0 |
| 0.7541666666666668 | 0 |
| 0.7548611111111111 | 0 |
| 0.7555555555555555 | 0 |
| 0.75625 | 0 |
| 0.7569444444444445 | 0 |
| 0.7576388888888889 | 0 |
| 0.7583333333333333 | 0 |
| 0.7590277777777777 | 0 |
| 0.7597222222222223 | 0 |
| 0.7604166666666666 | 0 |
| 0.7611111111111111 | 0 |
| 0.7618055555555556 | 0 |
| 0.7625000000000001 | 0 |
| 0.7631944444444444 | 0 |
| 0.7638888888888888 | 0 |
| 0.7645833333333334 | 0 |
| 0.7652777777777778 | 0 |
| 0.7659722222222222 | 0 |
| 0.7666666666666666 | 0 |
| 0.7673611111111112 | 0 |
| 0.7680555555555556 | 0 |
| 0.7687499999999999 | 0 |
| 0.7694444444444444 | 0 |
| 0.7701388888888889 | 0 |
| 0.7708333333333334 | 0 |
| 0.7715277777777777 | 0 |
| 0.7722222222222223 | 0 |
| 0.7729166666666667 | 0 |
| 0.7736111111111111 | 0 |
| 0.7743055555555555 | 0 |
| 0.775 | 0 |
| 0.7756944444444445 | 0 |
| 0.7763888888888889 | 0 |
| 0.7770833333333332 | 0 |
| 0.7777777777777778 | 0 |
| 0.7784722222222222 | 0 |
| 0.7791666666666667 | 0 |
| 0.779861111111111 | 0 |
| 0.7805555555555556 | 0 |
| 0.78125 | 0 |
| 0.7819444444444444 | 0 |
| 0.782638888888889 | 0 |
| 0.7833333333333333 | 0 |
| 0.7840277777777778 | 0 |
| 0.7847222222222222 | 0 |
| 0.7854166666666668 | 0 |
| 0.7861111111111111 | 0 |
| 0.7868055555555555 | 0 |
| 0.7875 | 0 |
| 0.7881944444444445 | 0 |
| 0.7888888888888889 | 0 |
| 0.7895833333333333 | 0 |
| 0.7902777777777777 | 0 |
| 0.7909722222222223 | 0 |
| 0.7916666666666666 | 0 |
| 0.7923611111111111 | 0 |
| 0.7930555555555556 | 0 |
| 0.7937500000000001 | 0 |
| 0.7944444444444444 | 0 |
| 0.7951388888888888 | 0 |
| 0.7958333333333334 | 0 |
| 0.7965277777777778 | 0 |
| 0.7972222222222222 | 0 |
| 0.7979166666666666 | 0 |
| 0.7986111111111112 | 0 |
| 0.7993055555555556 | 0 |
| 0.7999999999999999 | 0 |
| 0.8006944444444444 | 0 |
| 0.8013888888888889 | 0 |
| 0.8020833333333334 | 0 |
| 0.8027777777777777 | 0 |
| 0.8034722222222223 | 0 |
| 0.8041666666666667 | 0 |
| 0.8048611111111111 | 0 |
| 0.8055555555555555 | 0 |
| 0.80625 | 0 |
| 0.8069444444444445 | 0 |
| 0.8076388888888889 | 0 |
| 0.8083333333333332 | 0 |
| 0.8090277777777778 | 0 |
| 0.8097222222222222 | 0 |
| 0.8104166666666667 | 0 |
| 0.811111111111111 | 0 |
| 0.8118055555555556 | 0 |
| 0.8125 | 0 |
| 0.8131944444444444 | 0 |
| 0.813888888888889 | 0 |
| 0.8145833333333333 | 0 |
| 0.8152777777777778 | 0 |
| 0.8159722222222222 | 0 |
| 0.8166666666666668 | 0 |
| 0.8173611111111111 | 0 |
| 0.8180555555555555 | 0 |
| 0.81875 | 0 |
| 0.8194444444444445 | 0 |
| 0.8201388888888889 | 0 |
| 0.8208333333333333 | 0 |
| 0.8215277777777777 | 0 |
| 0.8222222222222223 | 0 |
| 0.8229166666666666 | 0 |
| 0.8236111111111111 | 0 |
| 0.8243055555555556 | 0 |
| 0.8250000000000001 | 0 |
| 0.8256944444444444 | 0 |
| 0.8263888888888888 | 0 |
| 0.8270833333333334 | 0 |
| 0.8277777777777778 | 0 |
| 0.8284722222222222 | 0 |
| 0.8291666666666666 | 0 |
| 0.8298611111111112 | 0 |
| 0.8305555555555556 | 0 |
| 0.8312499999999999 | 0 |
| 0.8319444444444444 | 0 |
| 0.8326388888888889 | 0 |
| 0.8333333333333334 | 0 |
| 0.8340277777777777 | 0 |
| 0.8347222222222223 | 0 |
| 0.8354166666666667 | 0 |
| 0.8361111111111111 | 0 |
| 0.8368055555555555 | 0 |
| 0.8375 | 0 |
| 0.8381944444444445 | 0 |
| 0.8388888888888889 | 0 |
| 0.8395833333333332 | 0 |
| 0.8402777777777778 | 0 |
| 0.8409722222222222 | 0 |
| 0.8416666666666667 | 0 |
| 0.842361111111111 | 0 |
| 0.8430555555555556 | 0 |
| 0.84375 | 0 |
| 0.8444444444444444 | 0 |
| 0.845138888888889 | 0 |
| 0.8458333333333333 | 0 |
| 0.8465277777777778 | 0 |
| 0.8472222222222222 | 0 |
| 0.8479166666666668 | 0 |
| 0.8486111111111111 | 0 |
| 0.8493055555555555 | 0 |
| 0.85 | 0 |
| 0.8506944444444445 | 0 |
| 0.8513888888888889 | 0 |
| 0.8520833333333333 | 0 |
| 0.8527777777777777 | 0 |
| 0.8534722222222223 | 0 |
| 0.8541666666666666 | 0 |
| 0.8548611111111111 | 0 |
| 0.8555555555555556 | 0 |
| 0.8562500000000001 | 0 |
| 0.8569444444444444 | 0 |
| 0.8576388888888888 | 0 |
| 0.8583333333333334 | 0 |
| 0.8590277777777778 | 0 |
| 0.8597222222222222 | 0 |
| 0.8604166666666666 | 0 |
| 0.8611111111111112 | 0 |
| 0.8618055555555556 | 0 |
| 0.8624999999999999 | 0 |
| 0.8631944444444444 | 0 |
| 0.8638888888888889 | 0 |
| 0.8645833333333334 | 0 |
| 0.8652777777777777 | 0 |
| 0.8659722222222223 | 0 |
| 0.8666666666666667 | 0 |
| 0.8673611111111111 | 0 |
| 0.8680555555555555 | 0 |
| 0.86875 | 0 |
| 0.8694444444444445 | 0 |
| 0.8701388888888889 | 0 |
| 0.8708333333333332 | 0 |
| 0.8715277777777778 | 0 |
| 0.8722222222222222 | 0 |
| 0.8729166666666667 | 0 |
| 0.873611111111111 | 0 |
| 0.8743055555555556 | 0 |
| 0.875 | 0 |
| 0.8756944444444444 | 0 |
| 0.876388888888889 | 0 |
| 0.8770833333333333 | 0 |
| 0.8777777777777778 | 0 |
| 0.8784722222222222 | 0 |
| 0.8791666666666668 | 0 |
| 0.8798611111111111 | 0 |
| 0.8805555555555555 | 0 |
| 0.88125 | 0 |
| 0.8819444444444445 | 0 |
| 0.8826388888888889 | 0 |
| 0.8833333333333333 | 0 |
| 0.8840277777777777 | 0 |
| 0.8847222222222223 | 0 |
| 0.8854166666666666 | 0 |
| 0.8861111111111111 | 0 |
| 0.8868055555555556 | 0 |
| 0.8875000000000001 | 0 |
| 0.8881944444444444 | 0 |
| 0.8888888888888888 | 0 |
| 0.8895833333333334 | 0 |
| 0.8902777777777778 | 0 |
| 0.8909722222222222 | 0 |
| 0.8916666666666666 | 0 |
| 0.8923611111111112 | 0 |
| 0.8930555555555556 | 0 |
| 0.8937499999999999 | 0 |
| 0.8944444444444444 | 0 |
| 0.8951388888888889 | 0 |
| 0.8958333333333334 | 0 |
| 0.8965277777777777 | 0 |
| 0.8972222222222223 | 0 |
| 0.8979166666666667 | 0 |
| 0.8986111111111111 | 0 |
| 0.8993055555555555 | 0 |
| 0.9 | 0 |
| 0.9006944444444445 | 0 |
| 0.9013888888888889 | 0 |
| 0.9020833333333332 | 0 |
| 0.9027777777777778 | 0 |
| 0.9034722222222222 | 0 |
| 0.9041666666666667 | 0 |
| 0.904861111111111 | 0 |
| 0.9055555555555556 | 0 |
| 0.90625 | 0 |
| 0.9069444444444444 | 0 |
| 0.907638888888889 | 0 |
| 0.9083333333333333 | 0 |
| 0.9090277777777778 | 0 |
| 0.9097222222222222 | 0 |
| 0.9104166666666668 | 0 |
| 0.9111111111111111 | 0 |
| 0.9118055555555555 | 0 |
| 0.9125 | 0 |
| 0.9131944444444445 | 0 |
| 0.9138888888888889 | 0 |
| 0.9145833333333333 | 0 |
| 0.9152777777777777 | 0 |
| 0.9159722222222223 | 0 |
| 0.9166666666666666 | 0 |
| 0.9173611111111111 | 0 |
| 0.9180555555555556 | 0 |
| 0.9187500000000001 | 0 |
| 0.9194444444444444 | 0 |
| 0.9201388888888888 | 0 |
| 0.9208333333333334 | 0 |
| 0.9215277777777778 | 0 |
| 0.9222222222222222 | 0 |
| 0.9229166666666666 | 0 |
| 0.9236111111111112 | 0 |
| 0.9243055555555556 | 0 |
| 0.9249999999999999 | 0 |
| 0.9256944444444444 | 0 |
| 0.9263888888888889 | 0 |
| 0.9270833333333334 | 0 |
| 0.9277777777777777 | 0 |
| 0.9284722222222223 | 0 |
| 0.9291666666666667 | 0 |
| 0.9298611111111111 | 0 |
| 0.9305555555555555 | 0 |
| 0.93125 | 0 |
| 0.9319444444444445 | 0 |
| 0.9326388888888889 | 0 |
| 0.9333333333333332 | 0 |
| 0.9340277777777778 | 0 |
| 0.9347222222222222 | 0 |
| 0.9354166666666667 | 0 |
| 0.936111111111111 | 0 |
| 0.9368055555555556 | 0 |
| 0.9375 | 0 |
| 0.9381944444444444 | 0 |
| 0.938888888888889 | 0 |
| 0.9395833333333333 | 0 |
| 0.9402777777777778 | 0 |
| 0.9409722222222222 | 0 |
| 0.9416666666666668 | 0 |
| 0.9423611111111111 | 0 |
| 0.9430555555555555 | 0 |
| 0.94375 | 0 |
| 0.9444444444444445 | 0 |
| 0.9451388888888889 | 0 |
| 0.9458333333333333 | 0 |
| 0.9465277777777777 | 0 |
| 0.9472222222222223 | 0 |
| 0.9479166666666666 | 0 |
| 0.9486111111111111 | 0 |
| 0.9493055555555556 | 0 |
| 0.9500000000000001 | 0 |
| 0.9506944444444444 | 0 |
| 0.9513888888888888 | 0 |
| 0.9520833333333334 | 0 |
| 0.9527777777777778 | 0 |
| 0.9534722222222222 | 0 |
| 0.9541666666666666 | 0 |
| 0.9548611111111112 | 0 |
| 0.9555555555555556 | 0 |
| 0.9562499999999999 | 0 |
| 0.9569444444444444 | 0 |
| 0.9576388888888889 | 0 |
| 0.9583333333333334 | 0 |
| 0.9590277777777777 | 0 |
| 0.9597222222222223 | 0 |
| 0.9604166666666667 | 0 |
| 0.9611111111111111 | 0 |
| 0.9618055555555555 | 0 |
| 0.9625 | 0 |
| 0.9631944444444445 | 0 |
| 0.9638888888888889 | 0 |
| 0.9645833333333332 | 0 |
| 0.9652777777777778 | 0 |
| 0.9659722222222222 | 0 |
| 0.9666666666666667 | 0 |
| 0.967361111111111 | 0 |
| 0.9680555555555556 | 0 |
| 0.96875 | 0 |
| 0.9694444444444444 | 0 |
| 0.970138888888889 | 0 |
| 0.9708333333333333 | 0 |
| 0.9715277777777778 | 0 |
| 0.9722222222222222 | 0 |
| 0.9729166666666668 | 0 |
| 0.9736111111111111 | 0 |
| 0.9743055555555555 | 0 |
| 0.975 | 0 |
| 0.9756944444444445 | 0 |
| 0.9763888888888889 | 0 |
| 0.9770833333333333 | 0 |
| 0.9777777777777777 | 0 |
| 0.9784722222222223 | 0 |
| 0.9791666666666666 | 0 |
| 0.9798611111111111 | 0 |
| 0.9805555555555556 | 0 |
| 0.9812500000000001 | 0 |
| 0.9819444444444444 | 0 |
| 0.9826388888888888 | 0 |
| 0.9833333333333334 | 0 |
| 0.9840277777777778 | 0 |
| 0.9847222222222222 | 0 |
| 0.9854166666666666 | 0 |
| 0.9861111111111112 | 0 |
| 0.9868055555555556 | 0 |
| 0.9874999999999999 | 0 |
| 0.9881944444444444 | 0 |
| 0.9888888888888889 | 0 |
| 0.9895833333333334 | 0 |
| 0.9902777777777777 | 0 |
| 0.9909722222222223 | 0 |
| 0.9916666666666667 | 0 |
| 0.9923611111111111 | 0 |
| 0.9930555555555555 | 0 |
| 0.99375 | 0 |
| 0.9944444444444445 | 0 |
| 0.9951388888888889 | 0 |
| 0.9958333333333332 | 0 |
| 0.9965277777777778 | 0 |
| 0.9972222222222222 | 0 |
| 0.9979166666666667 | 0 |
| 0.998611111111111 | 0 |
| 0.9993055555555556 | 0 |